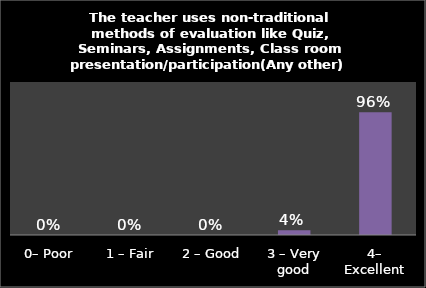
| Category | Series 0 |
|---|---|
| 0– Poor | 0 |
| 1 – Fair | 0 |
| 2 – Good | 0 |
| 3 – Very good | 0.037 |
| 4– Excellent | 0.963 |